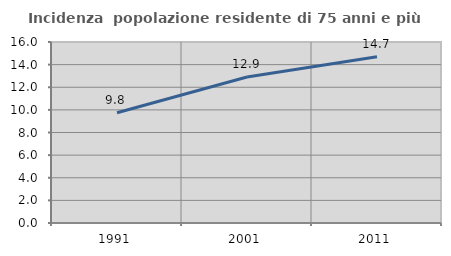
| Category | Incidenza  popolazione residente di 75 anni e più |
|---|---|
| 1991.0 | 9.751 |
| 2001.0 | 12.903 |
| 2011.0 | 14.697 |